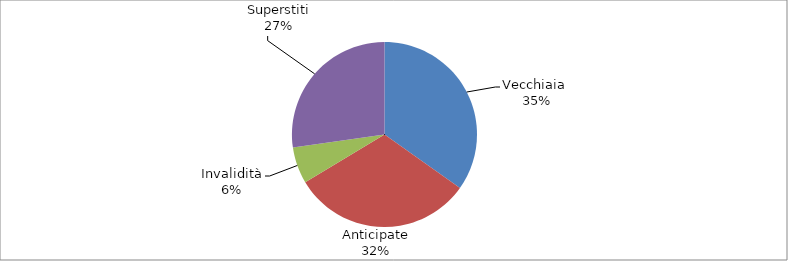
| Category | Series 0 |
|---|---|
| Vecchiaia  | 15222 |
| Anticipate | 13795 |
| Invalidità | 2789 |
| Superstiti | 11908 |